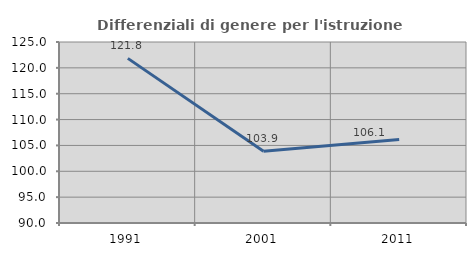
| Category | Differenziali di genere per l'istruzione superiore |
|---|---|
| 1991.0 | 121.834 |
| 2001.0 | 103.866 |
| 2011.0 | 106.133 |